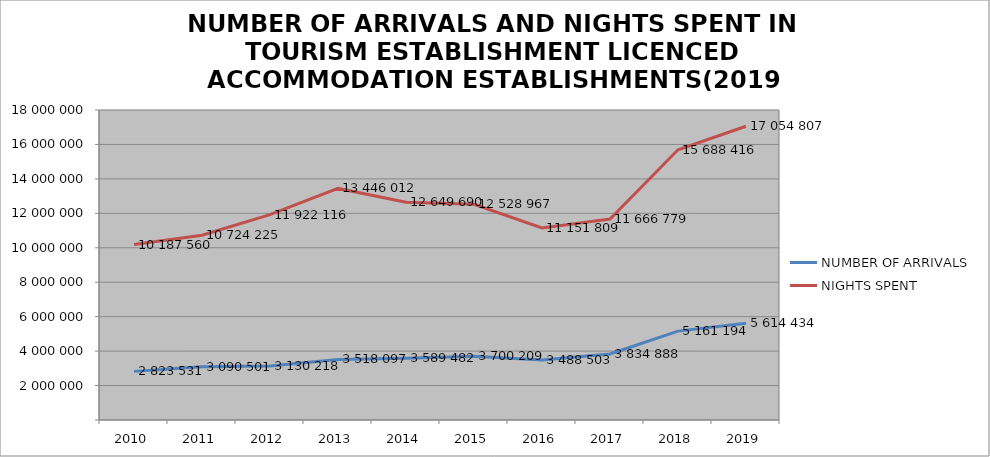
| Category | NUMBER OF ARRIVALS | NIGHTS SPENT |
|---|---|---|
| 2010 | 2823531 | 10187560 |
| 2011 | 3090501 | 10724225 |
| 2012 | 3130218 | 11922116 |
| 2013 | 3518097 | 13446012 |
| 2014 | 3589482 | 12649690 |
| 2015 | 3700209 | 12528967 |
| 2016 | 3488503 | 11151809 |
| 2017 | 3834888 | 11666779 |
| 2018 | 5161194 | 15688416 |
| 2019 | 5614434 | 17054807 |